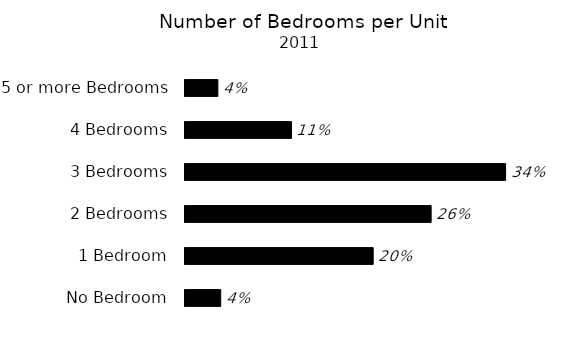
| Category | Series 0 |
|---|---|
| No Bedroom | 0.038 |
| 1 Bedroom | 0.202 |
| 2 Bedrooms | 0.265 |
| 3 Bedrooms | 0.345 |
| 4 Bedrooms | 0.115 |
| 5 or more Bedrooms | 0.035 |